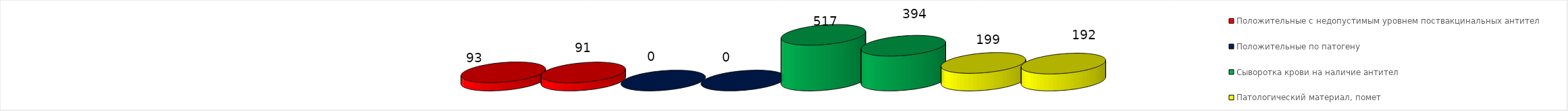
| Category | Положительные с недопустимым уровнем поствакцинальных антител | Положительные по патогену | Сыворотка крови на наличие антител | Патологический материал, помет |
|---|---|---|---|---|
| Сыворотка крови на наличие антител | 91 | 0 | 394 | 192 |